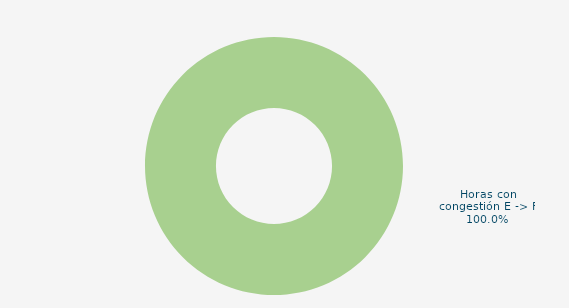
| Category | Horas con congestión E -> F |
|---|---|
| Horas con congestión E -> F | 100 |
| Horas con congestión F -> E | 0 |
| Horas sin congestión | 0 |